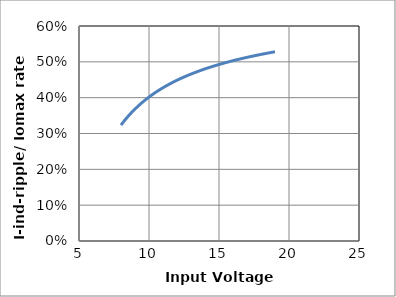
| Category | I-ind-ripple/ Iomax % |
|---|---|
| 8.0 | 0.323 |
| 8.1 | 0.329 |
| 8.2 | 0.334 |
| 8.299999999999999 | 0.338 |
| 8.399999999999999 | 0.343 |
| 8.499999999999998 | 0.348 |
| 8.599999999999998 | 0.352 |
| 8.699999999999998 | 0.356 |
| 8.799999999999997 | 0.36 |
| 8.899999999999997 | 0.364 |
| 8.999999999999996 | 0.368 |
| 9.499999999999996 | 0.386 |
| 9.999999999999996 | 0.402 |
| 10.499999999999996 | 0.415 |
| 10.999999999999996 | 0.428 |
| 11.499999999999996 | 0.439 |
| 11.999999999999996 | 0.449 |
| 12.499999999999996 | 0.458 |
| 12.999999999999996 | 0.466 |
| 13.499999999999996 | 0.473 |
| 13.999999999999996 | 0.48 |
| 14.499999999999996 | 0.487 |
| 14.999999999999996 | 0.493 |
| 15.499999999999996 | 0.498 |
| 15.999999999999996 | 0.503 |
| 16.499999999999996 | 0.508 |
| 16.999999999999996 | 0.512 |
| 17.499999999999996 | 0.517 |
| 17.999999999999996 | 0.521 |
| 18.499999999999996 | 0.524 |
| 19.0 | 0.528 |